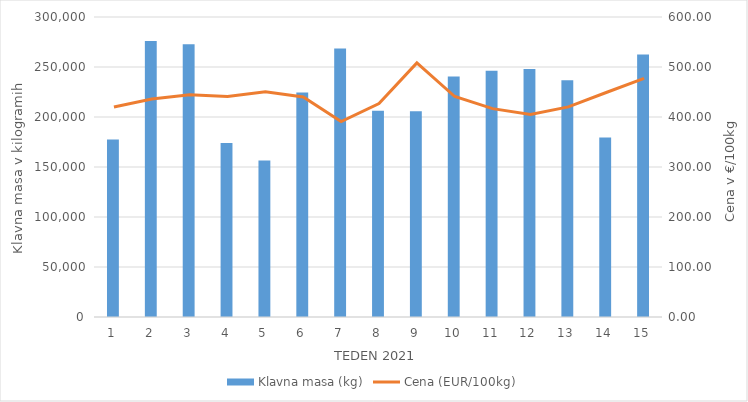
| Category | Klavna masa (kg) |
|---|---|
| 1.0 | 177573 |
| 2.0 | 275951 |
| 3.0 | 272797 |
| 4.0 | 174056 |
| 5.0 | 156508 |
| 6.0 | 224595 |
| 7.0 | 268436 |
| 8.0 | 206193 |
| 9.0 | 205669 |
| 10.0 | 240592 |
| 11.0 | 246325 |
| 12.0 | 248020 |
| 13.0 | 236703 |
| 14.0 | 179478 |
| 15.0 | 262544 |